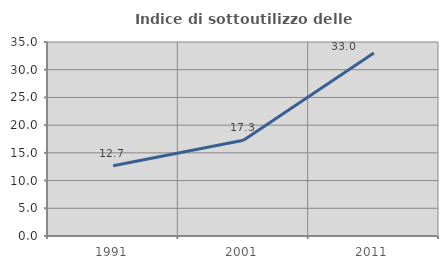
| Category | Indice di sottoutilizzo delle abitazioni  |
|---|---|
| 1991.0 | 12.686 |
| 2001.0 | 17.273 |
| 2011.0 | 33.01 |